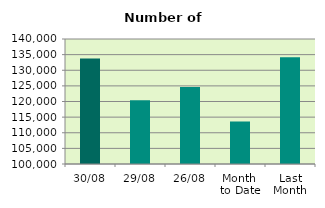
| Category | Series 0 |
|---|---|
| 30/08 | 133748 |
| 29/08 | 120398 |
| 26/08 | 124672 |
| Month 
to Date | 113602.364 |
| Last
Month | 134197.333 |